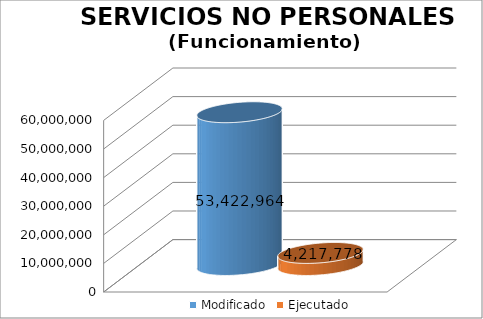
| Category | Modificado | Ejecutado |
|---|---|---|
| 0 | 53422964 | 4217778.35 |